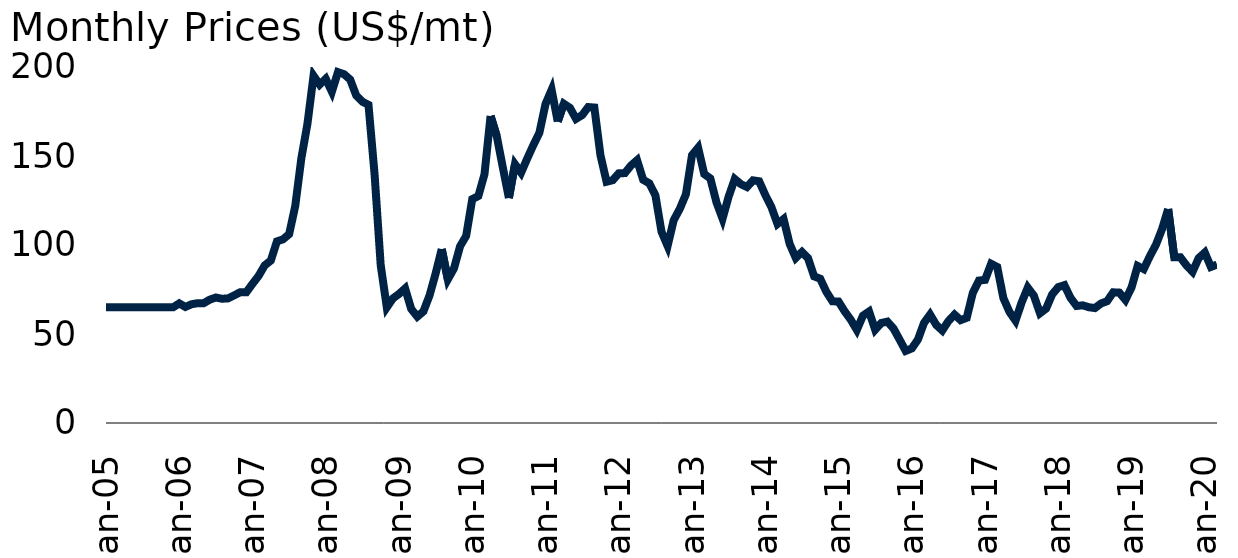
| Category | Iron.ore |
|---|---|
| 2005-01-01 | 65 |
| 2005-02-01 | 65 |
| 2005-03-01 | 65 |
| 2005-04-01 | 65 |
| 2005-05-01 | 65 |
| 2005-06-01 | 65 |
| 2005-07-01 | 65 |
| 2005-08-01 | 65 |
| 2005-09-01 | 65 |
| 2005-10-01 | 65 |
| 2005-11-01 | 65 |
| 2005-12-01 | 65 |
| 2006-01-01 | 67.2 |
| 2006-02-01 | 65.2 |
| 2006-03-01 | 66.7 |
| 2006-04-01 | 67.3 |
| 2006-05-01 | 67.3 |
| 2006-06-01 | 69.3 |
| 2006-07-01 | 70.5 |
| 2006-08-01 | 69.8 |
| 2006-09-01 | 70 |
| 2006-10-01 | 71.7 |
| 2006-11-01 | 73.5 |
| 2006-12-01 | 73.5 |
| 2007-01-01 | 78.2 |
| 2007-02-01 | 82.66 |
| 2007-03-01 | 88.55 |
| 2007-04-01 | 91.26 |
| 2007-05-01 | 102.02 |
| 2007-06-01 | 103.21 |
| 2007-07-01 | 106.09 |
| 2007-08-01 | 121.89 |
| 2007-09-01 | 148.65 |
| 2007-10-01 | 168.11 |
| 2007-11-01 | 195.09 |
| 2007-12-01 | 190.12 |
| 2008-01-01 | 193.37 |
| 2008-02-01 | 186.12 |
| 2008-03-01 | 197.12 |
| 2008-04-01 | 195.95 |
| 2008-05-01 | 192.95 |
| 2008-06-01 | 183.93 |
| 2008-07-01 | 180.5 |
| 2008-08-01 | 178.74 |
| 2008-09-01 | 139.64 |
| 2008-10-01 | 88.67 |
| 2008-11-01 | 64.95 |
| 2008-12-01 | 69.98 |
| 2009-01-01 | 72.51 |
| 2009-02-01 | 75.59 |
| 2009-03-01 | 64.07 |
| 2009-04-01 | 59.78 |
| 2009-05-01 | 62.69 |
| 2009-06-01 | 71.66 |
| 2009-07-01 | 83.95 |
| 2009-08-01 | 97.67 |
| 2009-09-01 | 80.71 |
| 2009-10-01 | 86.79 |
| 2009-11-01 | 99.26 |
| 2009-12-01 | 105.07 |
| 2010-01-01 | 125.72 |
| 2010-02-01 | 127.49 |
| 2010-03-01 | 139.69 |
| 2010-04-01 | 172.47 |
| 2010-05-01 | 161.35 |
| 2010-06-01 | 143.63 |
| 2010-07-01 | 126.36 |
| 2010-08-01 | 145.34 |
| 2010-09-01 | 140.627 |
| 2010-10-01 | 148.481 |
| 2010-11-01 | 156.1 |
| 2010-12-01 | 163.1 |
| 2011-01-01 | 179.18 |
| 2011-02-01 | 187.18 |
| 2011-03-01 | 169.36 |
| 2011-04-01 | 179.33 |
| 2011-05-01 | 177.05 |
| 2011-06-01 | 170.88 |
| 2011-07-01 | 172.98 |
| 2011-08-01 | 177.5 |
| 2011-09-01 | 177.23 |
| 2011-10-01 | 150.43 |
| 2011-11-01 | 135.54 |
| 2011-12-01 | 136.39 |
| 2012-01-01 | 140.26 |
| 2012-02-01 | 140.4 |
| 2012-03-01 | 144.66 |
| 2012-04-01 | 147.64 |
| 2012-05-01 | 136.61 |
| 2012-06-01 | 134.66 |
| 2012-07-01 | 127.94 |
| 2012-08-01 | 107.5 |
| 2012-09-01 | 99.47 |
| 2012-10-01 | 113.95 |
| 2012-11-01 | 120.35 |
| 2012-12-01 | 128.511 |
| 2013-01-01 | 150.491 |
| 2013-02-01 | 154.639 |
| 2013-03-01 | 139.87 |
| 2013-04-01 | 137.391 |
| 2013-05-01 | 124.01 |
| 2013-06-01 | 114.815 |
| 2013-07-01 | 127.191 |
| 2013-08-01 | 137.055 |
| 2013-09-01 | 134.186 |
| 2013-10-01 | 132.573 |
| 2013-11-01 | 136.324 |
| 2013-12-01 | 135.79 |
| 2014-01-01 | 128.119 |
| 2014-02-01 | 121.37 |
| 2014-03-01 | 111.833 |
| 2014-04-01 | 114.581 |
| 2014-05-01 | 100.56 |
| 2014-06-01 | 92.743 |
| 2014-07-01 | 96.05 |
| 2014-08-01 | 92.614 |
| 2014-09-01 | 82.38 |
| 2014-10-01 | 81.06 |
| 2014-11-01 | 73.73 |
| 2014-12-01 | 68.39 |
| 2015-01-01 | 68.23 |
| 2015-02-01 | 62.75 |
| 2015-03-01 | 58.05 |
| 2015-04-01 | 52.28 |
| 2015-05-01 | 60.3 |
| 2015-06-01 | 62.63 |
| 2015-07-01 | 52.39 |
| 2015-08-01 | 56.19 |
| 2015-09-01 | 56.95 |
| 2015-10-01 | 53.12 |
| 2015-11-01 | 46.86 |
| 2015-12-01 | 40.5 |
| 2016-01-01 | 41.88 |
| 2016-02-01 | 46.83 |
| 2016-03-01 | 56.2 |
| 2016-04-01 | 60.92 |
| 2016-05-01 | 55.13 |
| 2016-06-01 | 51.98 |
| 2016-07-01 | 57.26 |
| 2016-08-01 | 60.89 |
| 2016-09-01 | 57.79 |
| 2016-10-01 | 59.09 |
| 2016-11-01 | 73.1 |
| 2016-12-01 | 80.02 |
| 2017-01-01 | 80.41 |
| 2017-02-01 | 89.44 |
| 2017-03-01 | 87.65 |
| 2017-04-01 | 70.22 |
| 2017-05-01 | 62.43 |
| 2017-06-01 | 57.48 |
| 2017-07-01 | 67.74 |
| 2017-08-01 | 76.07 |
| 2017-09-01 | 71.53 |
| 2017-10-01 | 61.66 |
| 2017-11-01 | 64.24 |
| 2017-12-01 | 72.25 |
| 2018-01-01 | 76.34 |
| 2018-02-01 | 77.46 |
| 2018-03-01 | 70.35 |
| 2018-04-01 | 65.75 |
| 2018-05-01 | 66.1 |
| 2018-06-01 | 65.04 |
| 2018-07-01 | 64.56 |
| 2018-08-01 | 67.15 |
| 2018-09-01 | 68.44 |
| 2018-10-01 | 73.41 |
| 2018-11-01 | 73.26 |
| 2018-12-01 | 69.16 |
| 2019-01-01 | 76.16 |
| 2019-02-01 | 88.22 |
| 2019-03-01 | 86.47 |
| 2019-04-01 | 93.7 |
| 2019-05-01 | 100.15 |
| 2019-06-01 | 108.94 |
| 2019-07-01 | 120.24 |
| 2019-08-01 | 93.07 |
| 2019-09-01 | 93.08 |
| 2019-10-01 | 88.53 |
| 2019-11-01 | 84.98 |
| 2019-12-01 | 92.65 |
| 2020-01-01 | 95.76 |
| 2020-02-01 | 87.68 |
| 2020-03-01 | 88.99 |